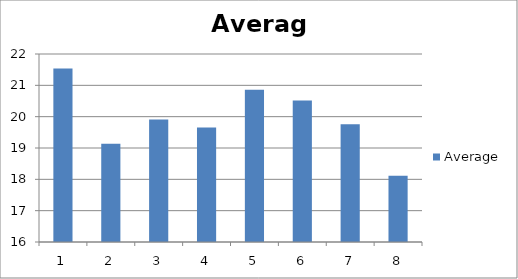
| Category | Average |
|---|---|
| 0 | 21.538 |
| 1 | 19.133 |
| 2 | 19.91 |
| 3 | 19.653 |
| 4 | 20.856 |
| 5 | 20.518 |
| 6 | 19.754 |
| 7 | 18.117 |